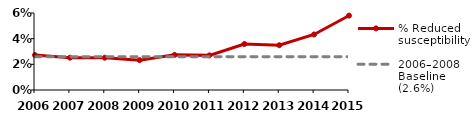
| Category | % Reduced susceptibility | 2006–2008 Baseline (2.6%) |
|---|---|---|
| 2006.0 | 0.027 | 0.026 |
| 2007.0 | 0.025 | 0.026 |
| 2008.0 | 0.025 | 0.026 |
| 2009.0 | 0.023 | 0.026 |
| 2010.0 | 0.027 | 0.026 |
| 2011.0 | 0.027 | 0.026 |
| 2012.0 | 0.036 | 0.026 |
| 2013.0 | 0.035 | 0.026 |
| 2014.0 | 0.043 | 0.026 |
| 2015.0 | 0.058 | 0.026 |